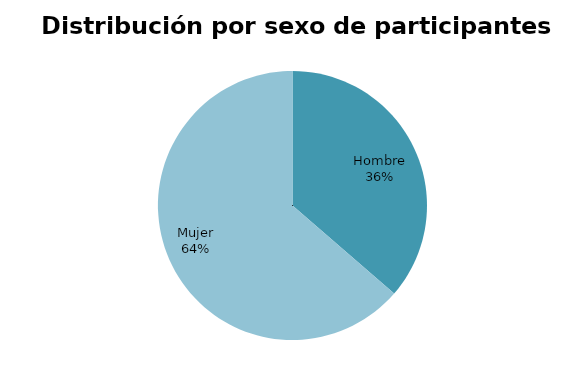
| Category | Series 0 |
|---|---|
| Hombre | 4 |
| Mujer | 7 |